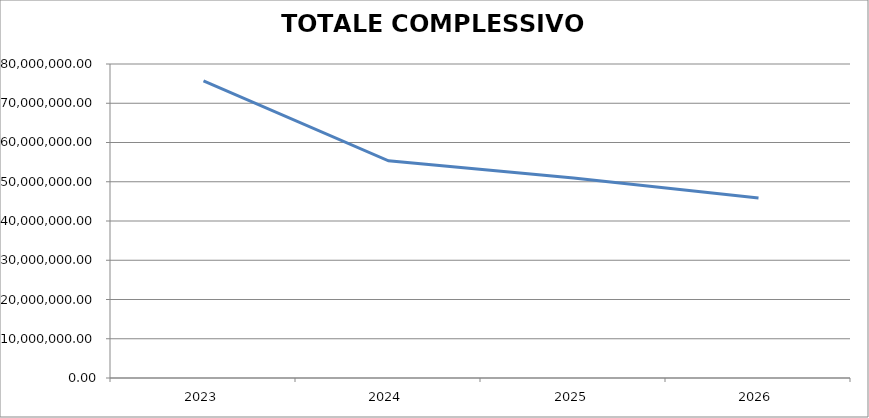
| Category | TOTALE COMPLESSIVO SPESE |
|---|---|
| 2023.0 | 75713002.25 |
| 2024.0 | 55323176.01 |
| 2025.0 | 50944024.63 |
| 2026.0 | 45879164.26 |